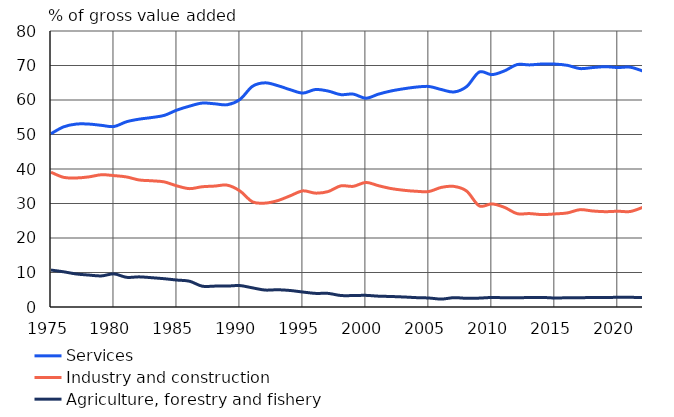
| Category | Services | Industry and construction | Agriculture, forestry and fishery |
|---|---|---|---|
| 1975 | 50.23 | 39.06 | 10.71 |
| 1976 | 52.213 | 37.585 | 10.202 |
| 1977 | 53.022 | 37.399 | 9.578 |
| 1978 | 53.029 | 37.712 | 9.259 |
| 1979 | 52.655 | 38.335 | 9.01 |
| 1980 | 52.314 | 38.087 | 9.6 |
| 1981 | 53.705 | 37.694 | 8.601 |
| 1982 | 54.446 | 36.817 | 8.737 |
| 1983 | 54.923 | 36.585 | 8.492 |
| 1984 | 55.548 | 36.257 | 8.195 |
| 1985 | 57.09 | 35.103 | 7.807 |
| 1986 | 58.223 | 34.309 | 7.468 |
| 1987 | 59.106 | 34.854 | 6.039 |
| 1988 | 58.899 | 35.049 | 6.052 |
| 1989 | 58.631 | 35.305 | 6.064 |
| 1990 | 60.156 | 33.633 | 6.211 |
| 1991 | 63.976 | 30.478 | 5.547 |
| 1992 | 64.979 | 30.114 | 4.906 |
| 1993 | 64.163 | 30.836 | 5.002 |
| 1994 | 62.97 | 32.246 | 4.783 |
| 1995 | 62.007 | 33.659 | 4.334 |
| 1996 | 63.045 | 33.008 | 3.948 |
| 1997 | 62.597 | 33.458 | 3.946 |
| 1998 | 61.561 | 35.105 | 3.334 |
| 1999 | 61.703 | 34.98 | 3.317 |
| 2000 | 60.52 | 36.105 | 3.376 |
| 2001 | 61.701 | 35.158 | 3.141 |
| 2002 | 62.619 | 34.334 | 3.047 |
| 2003 | 63.256 | 33.839 | 2.906 |
| 2004 | 63.742 | 33.54 | 2.717 |
| 2005 | 63.92 | 33.473 | 2.607 |
| 2006 | 63.023 | 34.682 | 2.295 |
| 2007 | 62.333 | 34.954 | 2.713 |
| 2008 | 63.897 | 33.597 | 2.506 |
| 2009 | 68.106 | 29.319 | 2.575 |
| 2010 | 67.348 | 29.888 | 2.764 |
| 2011 | 68.437 | 28.885 | 2.679 |
| 2012 | 70.256 | 27.064 | 2.679 |
| 2013 | 70.175 | 27.077 | 2.749 |
| 2014 | 70.433 | 26.785 | 2.781 |
| 2015 | 70.411 | 26.98 | 2.609 |
| 2016 | 70.043 | 27.275 | 2.682 |
| 2017 | 69.107 | 28.215 | 2.678 |
| 2018 | 69.403 | 27.829 | 2.768 |
| 2019 | 69.652 | 27.63 | 2.718 |
| 2020 | 69.415 | 27.753 | 2.831 |
| 2021 | 69.502 | 27.686 | 2.812 |
| 2022* | 68.372 | 28.919 | 2.71 |